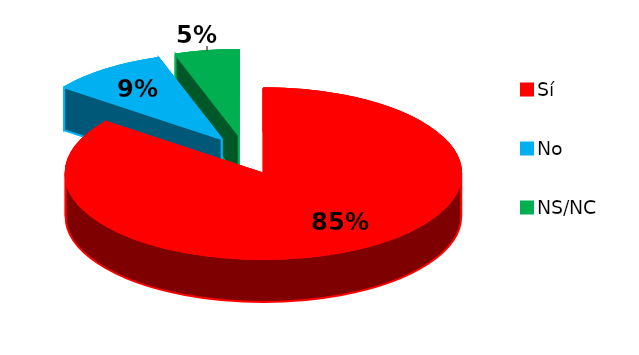
| Category | Series 0 |
|---|---|
| Sí | 99 |
| No | 11 |
| NS/NC | 6 |